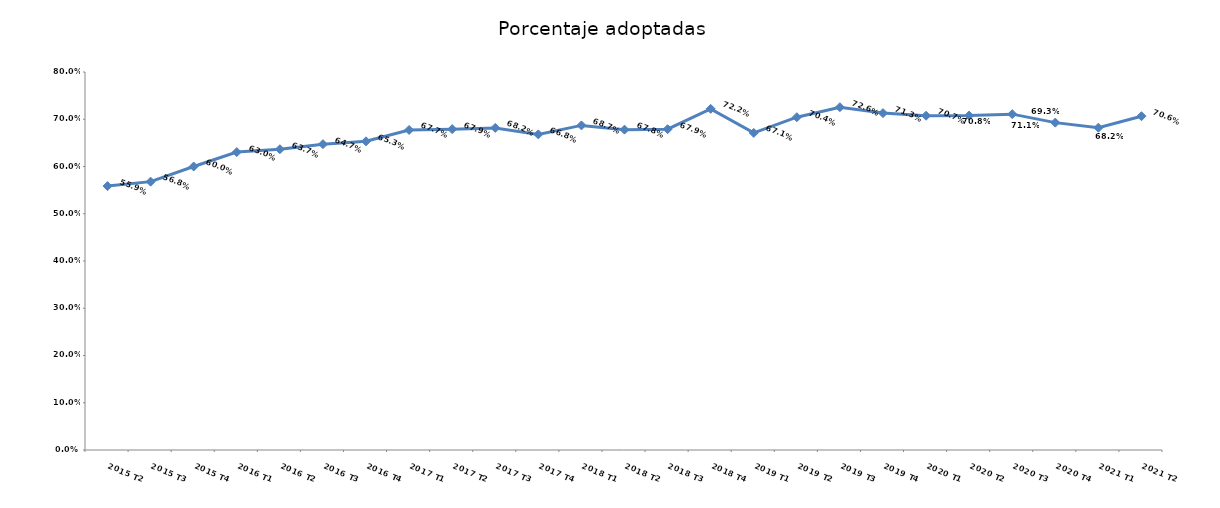
| Category | Porcentaje adoptadas |
|---|---|
| 2015 T2 | 0.559 |
| 2015 T3 | 0.568 |
| 2015 T4 | 0.6 |
| 2016 T1 | 0.63 |
| 2016 T2 | 0.637 |
| 2016 T3 | 0.647 |
| 2016 T4 | 0.653 |
| 2017 T1 | 0.677 |
| 2017 T2 | 0.679 |
| 2017 T3 | 0.682 |
| 2017 T4 | 0.668 |
| 2018 T1 | 0.687 |
| 2018 T2 | 0.678 |
| 2018 T3 | 0.679 |
| 2018 T4 | 0.722 |
| 2019 T1 | 0.671 |
| 2019 T2 | 0.704 |
| 2019 T3 | 0.726 |
| 2019 T4 | 0.713 |
| 2020 T1 | 0.707 |
| 2020 T2 | 0.708 |
| 2020 T3 | 0.711 |
| 2020 T4 | 0.693 |
| 2021 T1 | 0.682 |
| 2021 T2 | 0.706 |